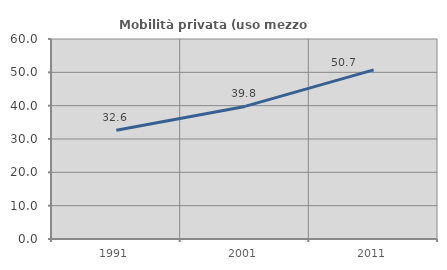
| Category | Mobilità privata (uso mezzo privato) |
|---|---|
| 1991.0 | 32.624 |
| 2001.0 | 39.773 |
| 2011.0 | 50.725 |